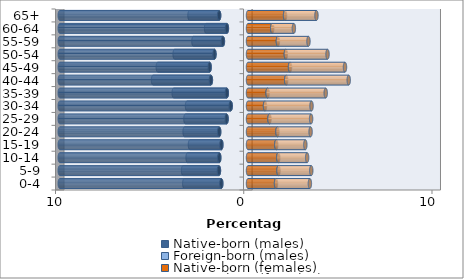
| Category | Native-born (males) | Foreign-born (males) | Native-born (females) | Foreign-born (females) |
|---|---|---|---|---|
| 0-4 | -1.419 | -1.966 | 1.489 | 1.799 |
| 5-9 | -1.544 | -1.906 | 1.621 | 1.74 |
| 10-14 | -1.526 | -1.682 | 1.609 | 1.533 |
| 15-19 | -1.415 | -1.668 | 1.502 | 1.544 |
| 20-24 | -1.532 | -1.836 | 1.564 | 1.761 |
| 25-29 | -1.138 | -2.185 | 1.141 | 2.211 |
| 30-34 | -0.919 | -2.32 | 0.904 | 2.471 |
| 35-39 | -1.124 | -2.822 | 1.042 | 3.087 |
| 40-44 | -1.971 | -3.073 | 2.028 | 3.323 |
| 45-49 | -2.038 | -2.753 | 2.233 | 2.919 |
| 50-54 | -1.781 | -2.115 | 2.011 | 2.214 |
| 55-59 | -1.333 | -1.566 | 1.588 | 1.624 |
| 60-64 | -1.121 | -1.105 | 1.287 | 1.15 |
| 65+ | -1.533 | -1.574 | 1.968 | 1.668 |